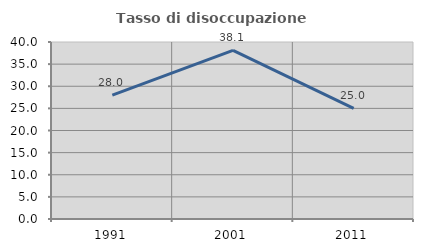
| Category | Tasso di disoccupazione giovanile  |
|---|---|
| 1991.0 | 28 |
| 2001.0 | 38.095 |
| 2011.0 | 25 |